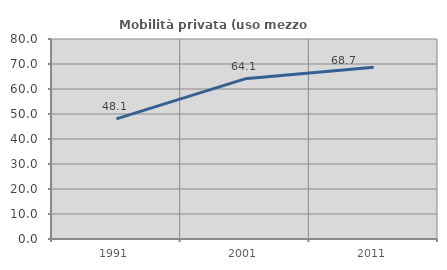
| Category | Mobilità privata (uso mezzo privato) |
|---|---|
| 1991.0 | 48.076 |
| 2001.0 | 64.076 |
| 2011.0 | 68.669 |